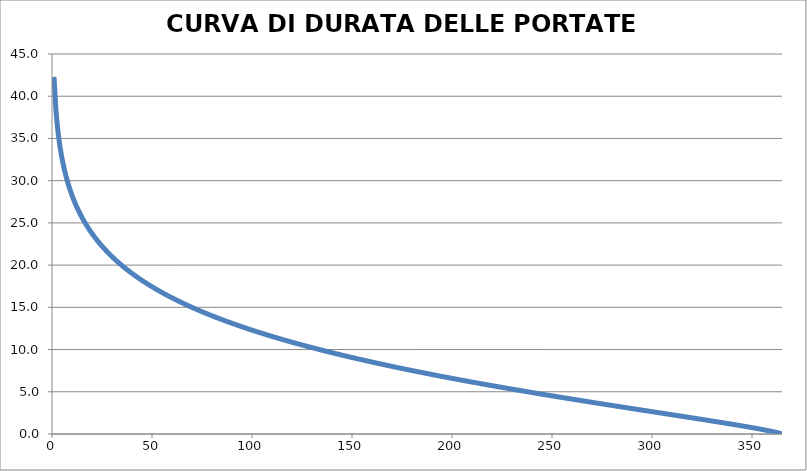
| Category | Series 0 |
|---|---|
| 1.0 | 42.291 |
| 2.0 | 38.199 |
| 3.0 | 35.759 |
| 4.0 | 34.004 |
| 5.0 | 32.629 |
| 6.0 | 31.495 |
| 7.0 | 30.529 |
| 8.0 | 29.687 |
| 9.0 | 28.94 |
| 10.0 | 28.267 |
| 11.0 | 27.656 |
| 12.0 | 27.095 |
| 13.0 | 26.577 |
| 14.0 | 26.095 |
| 15.0 | 25.645 |
| 16.0 | 25.222 |
| 17.0 | 24.823 |
| 18.0 | 24.445 |
| 19.0 | 24.087 |
| 20.0 | 23.746 |
| 21.0 | 23.421 |
| 22.0 | 23.11 |
| 23.0 | 22.811 |
| 24.0 | 22.525 |
| 25.0 | 22.25 |
| 26.0 | 21.984 |
| 27.0 | 21.728 |
| 28.0 | 21.481 |
| 29.0 | 21.241 |
| 30.0 | 21.009 |
| 31.0 | 20.785 |
| 32.0 | 20.567 |
| 33.0 | 20.355 |
| 34.0 | 20.148 |
| 35.0 | 19.948 |
| 36.0 | 19.752 |
| 37.0 | 19.562 |
| 38.0 | 19.376 |
| 39.0 | 19.195 |
| 40.0 | 19.018 |
| 41.0 | 18.845 |
| 42.0 | 18.675 |
| 43.0 | 18.51 |
| 44.0 | 18.347 |
| 45.0 | 18.189 |
| 46.0 | 18.033 |
| 47.0 | 17.88 |
| 48.0 | 17.731 |
| 49.0 | 17.584 |
| 50.0 | 17.44 |
| 51.0 | 17.298 |
| 52.0 | 17.159 |
| 53.0 | 17.022 |
| 54.0 | 16.888 |
| 55.0 | 16.756 |
| 56.0 | 16.626 |
| 57.0 | 16.498 |
| 58.0 | 16.372 |
| 59.0 | 16.248 |
| 60.0 | 16.126 |
| 61.0 | 16.005 |
| 62.0 | 15.887 |
| 63.0 | 15.77 |
| 64.0 | 15.655 |
| 65.0 | 15.541 |
| 66.0 | 15.429 |
| 67.0 | 15.318 |
| 68.0 | 15.209 |
| 69.0 | 15.102 |
| 70.0 | 14.995 |
| 71.0 | 14.89 |
| 72.0 | 14.787 |
| 73.0 | 14.684 |
| 74.0 | 14.583 |
| 75.0 | 14.483 |
| 76.0 | 14.384 |
| 77.0 | 14.287 |
| 78.0 | 14.19 |
| 79.0 | 14.095 |
| 80.0 | 14 |
| 81.0 | 13.907 |
| 82.0 | 13.815 |
| 83.0 | 13.723 |
| 84.0 | 13.633 |
| 85.0 | 13.543 |
| 86.0 | 13.455 |
| 87.0 | 13.367 |
| 88.0 | 13.28 |
| 89.0 | 13.194 |
| 90.0 | 13.109 |
| 91.0 | 13.025 |
| 92.0 | 12.941 |
| 93.0 | 12.859 |
| 94.0 | 12.777 |
| 95.0 | 12.695 |
| 96.0 | 12.615 |
| 97.0 | 12.535 |
| 98.0 | 12.456 |
| 99.0 | 12.378 |
| 100.0 | 12.3 |
| 101.0 | 12.223 |
| 102.0 | 12.147 |
| 103.0 | 12.071 |
| 104.0 | 11.996 |
| 105.0 | 11.921 |
| 106.0 | 11.847 |
| 107.0 | 11.774 |
| 108.0 | 11.701 |
| 109.0 | 11.629 |
| 110.0 | 11.558 |
| 111.0 | 11.487 |
| 112.0 | 11.416 |
| 113.0 | 11.346 |
| 114.0 | 11.277 |
| 115.0 | 11.208 |
| 116.0 | 11.139 |
| 117.0 | 11.071 |
| 118.0 | 11.004 |
| 119.0 | 10.937 |
| 120.0 | 10.87 |
| 121.0 | 10.804 |
| 122.0 | 10.738 |
| 123.0 | 10.673 |
| 124.0 | 10.609 |
| 125.0 | 10.544 |
| 126.0 | 10.48 |
| 127.0 | 10.417 |
| 128.0 | 10.354 |
| 129.0 | 10.291 |
| 130.0 | 10.229 |
| 131.0 | 10.167 |
| 132.0 | 10.106 |
| 133.0 | 10.044 |
| 134.0 | 9.984 |
| 135.0 | 9.923 |
| 136.0 | 9.863 |
| 137.0 | 9.804 |
| 138.0 | 9.744 |
| 139.0 | 9.685 |
| 140.0 | 9.627 |
| 141.0 | 9.569 |
| 142.0 | 9.511 |
| 143.0 | 9.453 |
| 144.0 | 9.396 |
| 145.0 | 9.339 |
| 146.0 | 9.282 |
| 147.0 | 9.226 |
| 148.0 | 9.17 |
| 149.0 | 9.114 |
| 150.0 | 9.059 |
| 151.0 | 9.003 |
| 152.0 | 8.949 |
| 153.0 | 8.894 |
| 154.0 | 8.84 |
| 155.0 | 8.786 |
| 156.0 | 8.732 |
| 157.0 | 8.678 |
| 158.0 | 8.625 |
| 159.0 | 8.572 |
| 160.0 | 8.52 |
| 161.0 | 8.467 |
| 162.0 | 8.415 |
| 163.0 | 8.363 |
| 164.0 | 8.311 |
| 165.0 | 8.26 |
| 166.0 | 8.209 |
| 167.0 | 8.158 |
| 168.0 | 8.107 |
| 169.0 | 8.056 |
| 170.0 | 8.006 |
| 171.0 | 7.956 |
| 172.0 | 7.906 |
| 173.0 | 7.856 |
| 174.0 | 7.807 |
| 175.0 | 7.758 |
| 176.0 | 7.709 |
| 177.0 | 7.66 |
| 178.0 | 7.611 |
| 179.0 | 7.563 |
| 180.0 | 7.515 |
| 181.0 | 7.467 |
| 182.0 | 7.419 |
| 183.0 | 7.371 |
| 184.0 | 7.324 |
| 185.0 | 7.277 |
| 186.0 | 7.23 |
| 187.0 | 7.183 |
| 188.0 | 7.136 |
| 189.0 | 7.09 |
| 190.0 | 7.043 |
| 191.0 | 6.997 |
| 192.0 | 6.951 |
| 193.0 | 6.905 |
| 194.0 | 6.86 |
| 195.0 | 6.814 |
| 196.0 | 6.769 |
| 197.0 | 6.724 |
| 198.0 | 6.679 |
| 199.0 | 6.634 |
| 200.0 | 6.589 |
| 201.0 | 6.545 |
| 202.0 | 6.501 |
| 203.0 | 6.456 |
| 204.0 | 6.412 |
| 205.0 | 6.368 |
| 206.0 | 6.325 |
| 207.0 | 6.281 |
| 208.0 | 6.237 |
| 209.0 | 6.194 |
| 210.0 | 6.151 |
| 211.0 | 6.108 |
| 212.0 | 6.065 |
| 213.0 | 6.022 |
| 214.0 | 5.979 |
| 215.0 | 5.937 |
| 216.0 | 5.894 |
| 217.0 | 5.852 |
| 218.0 | 5.81 |
| 219.0 | 5.768 |
| 220.0 | 5.726 |
| 221.0 | 5.684 |
| 222.0 | 5.642 |
| 223.0 | 5.601 |
| 224.0 | 5.559 |
| 225.0 | 5.518 |
| 226.0 | 5.477 |
| 227.0 | 5.436 |
| 228.0 | 5.395 |
| 229.0 | 5.354 |
| 230.0 | 5.313 |
| 231.0 | 5.272 |
| 232.0 | 5.232 |
| 233.0 | 5.191 |
| 234.0 | 5.151 |
| 235.0 | 5.111 |
| 236.0 | 5.071 |
| 237.0 | 5.031 |
| 238.0 | 4.991 |
| 239.0 | 4.951 |
| 240.0 | 4.911 |
| 241.0 | 4.871 |
| 242.0 | 4.832 |
| 243.0 | 4.792 |
| 244.0 | 4.753 |
| 245.0 | 4.713 |
| 246.0 | 4.674 |
| 247.0 | 4.635 |
| 248.0 | 4.596 |
| 249.0 | 4.557 |
| 250.0 | 4.518 |
| 251.0 | 4.479 |
| 252.0 | 4.44 |
| 253.0 | 4.402 |
| 254.0 | 4.363 |
| 255.0 | 4.324 |
| 256.0 | 4.286 |
| 257.0 | 4.248 |
| 258.0 | 4.209 |
| 259.0 | 4.171 |
| 260.0 | 4.133 |
| 261.0 | 4.095 |
| 262.0 | 4.057 |
| 263.0 | 4.019 |
| 264.0 | 3.981 |
| 265.0 | 3.943 |
| 266.0 | 3.905 |
| 267.0 | 3.867 |
| 268.0 | 3.83 |
| 269.0 | 3.792 |
| 270.0 | 3.754 |
| 271.0 | 3.717 |
| 272.0 | 3.679 |
| 273.0 | 3.642 |
| 274.0 | 3.604 |
| 275.0 | 3.567 |
| 276.0 | 3.53 |
| 277.0 | 3.493 |
| 278.0 | 3.455 |
| 279.0 | 3.418 |
| 280.0 | 3.381 |
| 281.0 | 3.344 |
| 282.0 | 3.307 |
| 283.0 | 3.27 |
| 284.0 | 3.233 |
| 285.0 | 3.196 |
| 286.0 | 3.159 |
| 287.0 | 3.122 |
| 288.0 | 3.086 |
| 289.0 | 3.049 |
| 290.0 | 3.012 |
| 291.0 | 2.975 |
| 292.0 | 2.939 |
| 293.0 | 2.902 |
| 294.0 | 2.865 |
| 295.0 | 2.828 |
| 296.0 | 2.792 |
| 297.0 | 2.755 |
| 298.0 | 2.719 |
| 299.0 | 2.682 |
| 300.0 | 2.645 |
| 301.0 | 2.609 |
| 302.0 | 2.572 |
| 303.0 | 2.535 |
| 304.0 | 2.499 |
| 305.0 | 2.462 |
| 306.0 | 2.426 |
| 307.0 | 2.389 |
| 308.0 | 2.352 |
| 309.0 | 2.316 |
| 310.0 | 2.279 |
| 311.0 | 2.242 |
| 312.0 | 2.206 |
| 313.0 | 2.169 |
| 314.0 | 2.132 |
| 315.0 | 2.096 |
| 316.0 | 2.059 |
| 317.0 | 2.022 |
| 318.0 | 1.985 |
| 319.0 | 1.948 |
| 320.0 | 1.911 |
| 321.0 | 1.874 |
| 322.0 | 1.837 |
| 323.0 | 1.8 |
| 324.0 | 1.763 |
| 325.0 | 1.726 |
| 326.0 | 1.689 |
| 327.0 | 1.651 |
| 328.0 | 1.614 |
| 329.0 | 1.576 |
| 330.0 | 1.539 |
| 331.0 | 1.501 |
| 332.0 | 1.463 |
| 333.0 | 1.425 |
| 334.0 | 1.387 |
| 335.0 | 1.349 |
| 336.0 | 1.311 |
| 337.0 | 1.272 |
| 338.0 | 1.234 |
| 339.0 | 1.195 |
| 340.0 | 1.156 |
| 341.0 | 1.117 |
| 342.0 | 1.077 |
| 343.0 | 1.038 |
| 344.0 | 0.998 |
| 345.0 | 0.958 |
| 346.0 | 0.918 |
| 347.0 | 0.877 |
| 348.0 | 0.837 |
| 349.0 | 0.795 |
| 350.0 | 0.754 |
| 351.0 | 0.712 |
| 352.0 | 0.669 |
| 353.0 | 0.626 |
| 354.0 | 0.583 |
| 355.0 | 0.539 |
| 356.0 | 0.494 |
| 357.0 | 0.448 |
| 358.0 | 0.402 |
| 359.0 | 0.354 |
| 360.0 | 0.305 |
| 361.0 | 0.254 |
| 362.0 | 0.2 |
| 363.0 | 0.144 |
| 364.0 | 0.082 |
| 365.0 | 0 |